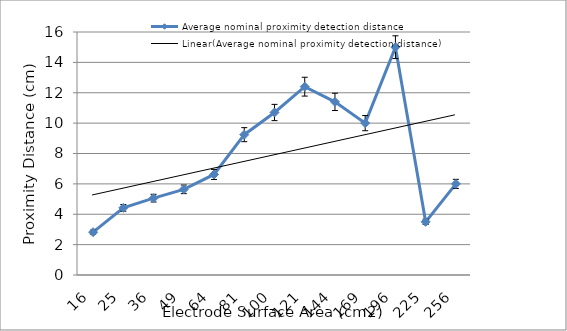
| Category | Average nominal proximity detection distance  |
|---|---|
| 16.0 | 2.82 |
| 25.0 | 4.42 |
| 36.0 | 5.06 |
| 49.0 | 5.64 |
| 64.0 | 6.62 |
| 81.0 | 9.24 |
| 100.0 | 10.7 |
| 121.0 | 12.4 |
| 144.0 | 11.4 |
| 169.0 | 10 |
| 196.0 | 15 |
| 225.0 | 3.5 |
| 256.0 | 6 |